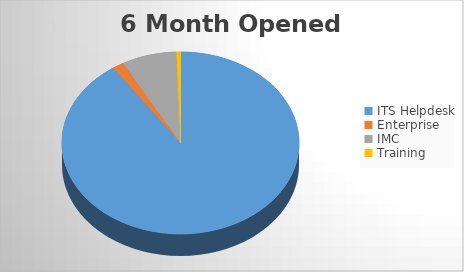
| Category | 6M Opened |
|---|---|
| ITS Helpdesk | 2456 |
| Enterprise | 42 |
| IMC | 204 |
| Training | 15 |